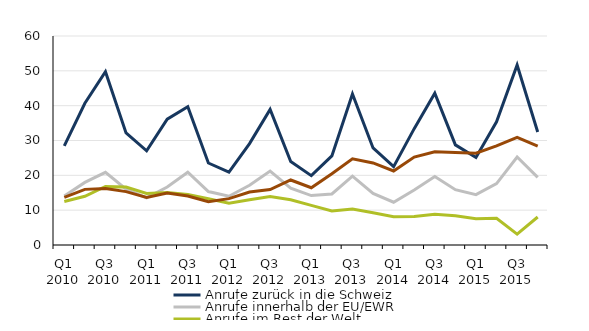
| Category | Anrufe zurück in die Schweiz | Anrufe innerhalb der EU/EWR | Anrufe im Rest der Welt | Sondervereinbarungen* |
|---|---|---|---|---|
| Q1 2010 | 28.477 | 14.043 | 12.489 | 13.652 |
| Q2 2010 | 40.682 | 17.976 | 13.986 | 15.97 |
| Q3 2010 | 49.76 | 20.857 | 16.822 | 16.244 |
| Q4 2010 | 32.182 | 16.05 | 16.647 | 15.322 |
| Q1 2011 | 27.028 | 13.521 | 14.802 | 13.655 |
| Q2 2011 | 36.123 | 16.639 | 15.063 | 14.947 |
| Q3 2011 | 39.695 | 20.905 | 14.504 | 14.061 |
| Q4 2011 | 23.538 | 15.355 | 13.262 | 12.398 |
| Q1 2012 | 20.928 | 14.002 | 12.014 | 13.307 |
| Q2 2012 | 29.105 | 17.135 | 12.979 | 15.196 |
| Q3 2012 | 38.934 | 21.224 | 13.948 | 15.909 |
| Q4 2012 | 23.94 | 16.329 | 13.001 | 18.661 |
| Q1 2013 | 19.918 | 14.191 | 11.39 | 16.433 |
| Q2 2013 | 25.585 | 14.657 | 9.773 | 20.455 |
| Q3 2013 | 43.334 | 19.779 | 10.348 | 24.744 |
| Q4 2013 | 27.865 | 14.812 | 9.282 | 23.559 |
| Q1 2014 | 22.49 | 12.275 | 8.142 | 21.246 |
| Q2 2014 | 33.407 | 15.78 | 8.206 | 25.237 |
| Q3 2014 | 43.568 | 19.644 | 8.861 | 26.774 |
| Q4 2014 | 28.737 | 15.874 | 8.377 | 26.556 |
| Q1 2015 | 25.115 | 14.452 | 7.557 | 26.365 |
| Q2 2015 | 35.362 | 17.622 | 7.694 | 28.469 |
| Q3 2015 | 51.661 | 25.26 | 3.124 | 30.91 |
| Q4 2015 | 32.442 | 19.399 | 8.036 | 28.397 |